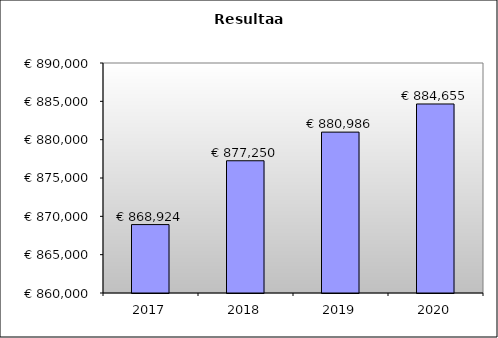
| Category | Series 0 |
|---|---|
| 2017.0 | 868924.054 |
| 2018.0 | 877249.791 |
| 2019.0 | 880985.716 |
| 2020.0 | 884655.04 |